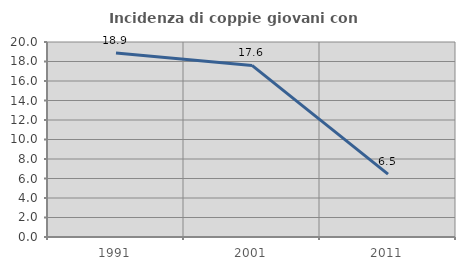
| Category | Incidenza di coppie giovani con figli |
|---|---|
| 1991.0 | 18.871 |
| 2001.0 | 17.602 |
| 2011.0 | 6.452 |